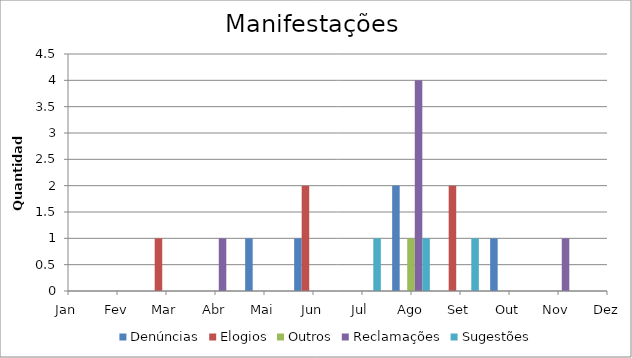
| Category | Denúncias | Elogios | Outros | Reclamações | Sugestões |
|---|---|---|---|---|---|
| Jan | 0 | 0 | 0 | 0 | 0 |
| Fev | 0 | 0 | 0 | 0 | 0 |
| Mar | 0 | 1 | 0 | 0 | 0 |
| Abr | 0 | 0 | 0 | 1 | 0 |
| Mai | 1 | 0 | 0 | 0 | 0 |
| Jun | 1 | 2 | 0 | 0 | 0 |
| Jul | 0 | 0 | 0 | 0 | 1 |
| Ago | 2 | 0 | 1 | 4 | 1 |
| Set | 0 | 2 | 0 | 0 | 1 |
| Out | 1 | 0 | 0 | 0 | 0 |
| Nov | 0 | 0 | 0 | 1 | 0 |
| Dez | 0 | 0 | 0 | 3 | 0 |